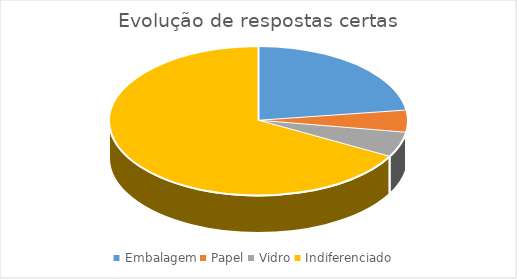
| Category | Series 0 |
|---|---|
| Embalagem | 16.364 |
| Papel | 3.419 |
| Vidro | 3.906 |
| Indiferenciado | 48.052 |